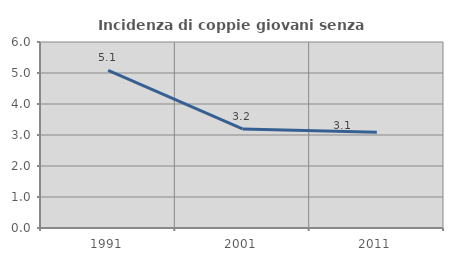
| Category | Incidenza di coppie giovani senza figli |
|---|---|
| 1991.0 | 5.081 |
| 2001.0 | 3.194 |
| 2011.0 | 3.085 |